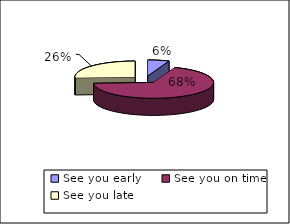
| Category | When you arrived at the surgery for your appointment did the doctor |
|---|---|
| See you early | 8 |
| See you on time | 95 |
| See you late | 36 |